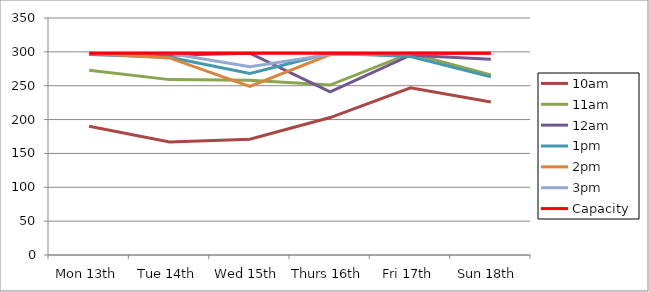
| Category | 9am | 10am | 11am | 12am | 1pm | 2pm | 3pm | 4pm | 5pm | Capacity |
|---|---|---|---|---|---|---|---|---|---|---|
| Mon 13th |  | 190 | 273 | 298 | 296 | 298 | 298 |  |  | 298 |
| Tue 14th |  | 167 | 259 | 295 | 292 | 291 | 298 |  |  | 298 |
| Wed 15th |  | 171 | 258 | 298 | 268 | 249 | 278 |  |  | 298 |
| Thurs 16th |  | 203 | 251 | 241 | 298 | 296 | 296 |  |  | 298 |
| Fri 17th |  | 247 | 298 | 295 | 293 | 298 | 298 |  |  | 298 |
| Sun 18th |  | 226 | 266 | 289 | 263 | 298 | 298 |  |  | 298 |